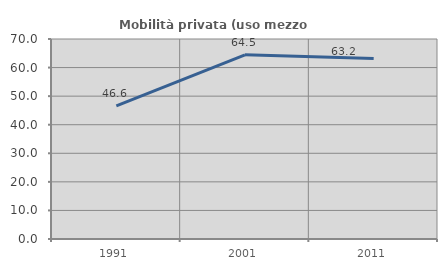
| Category | Mobilità privata (uso mezzo privato) |
|---|---|
| 1991.0 | 46.594 |
| 2001.0 | 64.46 |
| 2011.0 | 63.176 |